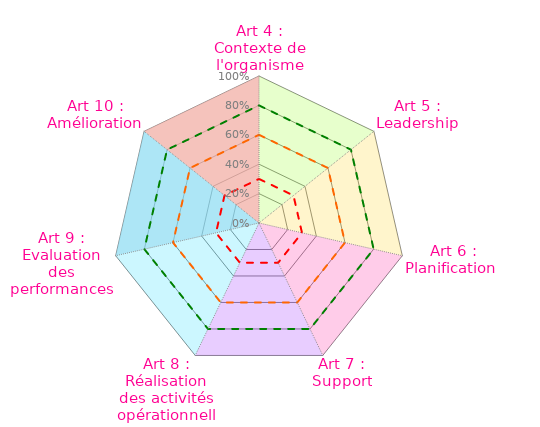
| Category | Coloriage Art4 | Coloriage Art5 | Coloriage Art6 | Coloriage Art7 | Coloriage Art8 | Coloriage Art9 | Coloriage Art10 | Conforme | Convaincant | Informel | Evaluation ISO 9001 |
|---|---|---|---|---|---|---|---|---|---|---|---|
| Art 4 : Contexte de l'organisme | 1 | 0 | 0 | 0 | 0 | 0 | 1 | 0.8 | 0.6 | 0.3 | 0 |
| Art 5 : Leadership | 1 | 1 | 0 | 0 | 0 | 0 | 0 | 0.8 | 0.6 | 0.3 | 0 |
| Art 6 : Planification  | 0 | 1 | 1 | 0 | 0 | 0 | 0 | 0.8 | 0.6 | 0.3 | 0 |
| Art 7 : Support | 0 | 0 | 1 | 1 | 0 | 0 | 0 | 0.8 | 0.6 | 0.3 | 0 |
| Art 8 : Réalisation des activités opérationnelles | 0 | 0 | 0 | 1 | 1 | 0 | 1 | 0.8 | 0.6 | 0.3 | 0 |
| Art 9 : Evaluation des performances | 0 | 0 | 0 | 0 | 1 | 1 | 0 | 0.8 | 0.6 | 0.3 | 0 |
| Art 10 : Amélioration | 0 | 0 | 0 | 0 | 0 | 1 | 1 | 0.8 | 0.6 | 0.3 | 0 |